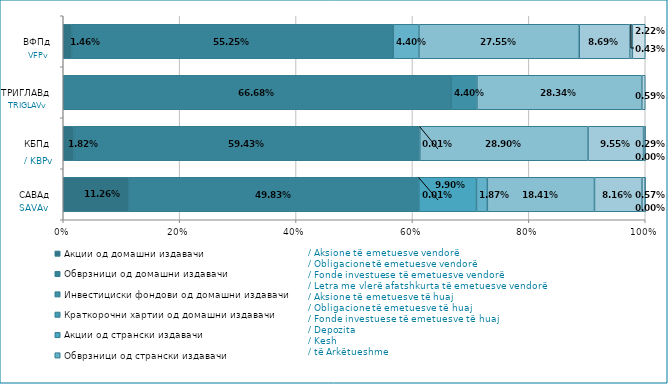
| Category | Акции од домашни издавачи  | Обврзници од домашни издавачи  | Инвестициски фондови од домашни издавачи   | Краткорочни хартии од домашни издавачи   | Акции од странски издавачи   | Обврзници од странски издавачи  | Инвестициски фондови од странски издавчи  | Депозити | Парични средства | Побарувања |
|---|---|---|---|---|---|---|---|---|---|---|
| САВАд | 0.113 | 0.498 | 0 | 0 | 0.099 | 0.019 | 0.184 | 0.082 | 0.006 | 0 |
| КБПд | 0.018 | 0.594 | 0 | 0 | 0 | 0 | 0.289 | 0.095 | 0.003 | 0 |
| ТРИГЛАВд | 0 | 0.667 | 0.044 | 0 | 0 | 0 | 0.283 | 0 | 0.006 | 0 |
| ВФПд | 0.015 | 0.552 | 0 | 0 | 0 | 0.044 | 0.276 | 0.087 | 0.004 | 0.022 |